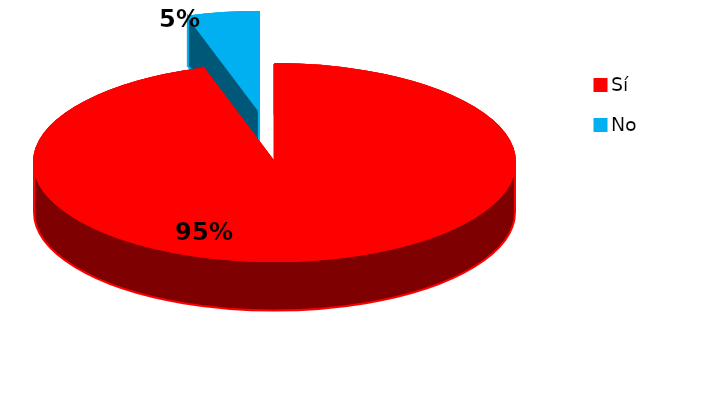
| Category | Series 0 |
|---|---|
| 0 | 20 |
| 1 | 1 |